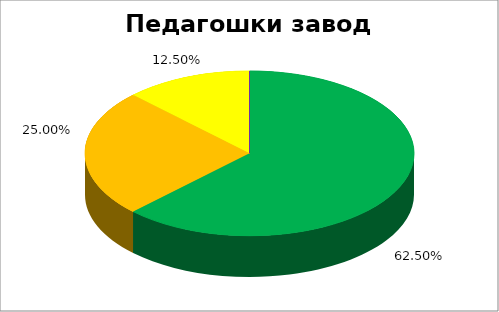
| Category | Педагошки завод Војводине |
|---|---|
| 0 | 0.625 |
| 1 | 0.25 |
| 2 | 0.125 |
| 3 | 0 |
| 4 | 0 |